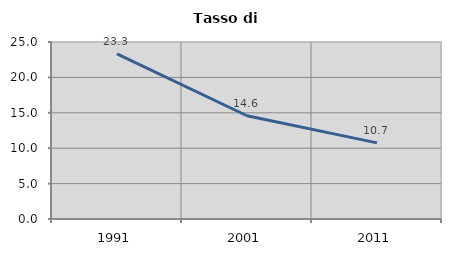
| Category | Tasso di disoccupazione   |
|---|---|
| 1991.0 | 23.326 |
| 2001.0 | 14.58 |
| 2011.0 | 10.75 |